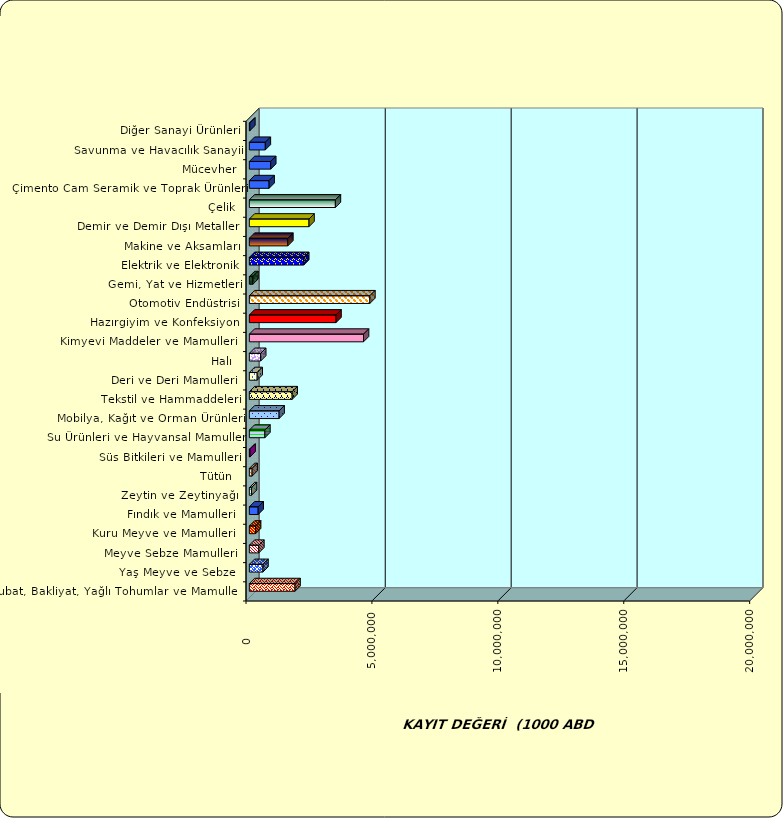
| Category | Series 0 |
|---|---|
|  Hububat, Bakliyat, Yağlı Tohumlar ve Mamulleri  | 1814326.473 |
|  Yaş Meyve ve Sebze   | 540674.135 |
|  Meyve Sebze Mamulleri  | 376441.702 |
|  Kuru Meyve ve Mamulleri   | 247503.136 |
|  Fındık ve Mamulleri  | 350421.304 |
|  Zeytin ve Zeytinyağı  | 85065.91 |
|  Tütün  | 110002.263 |
|  Süs Bitkileri ve Mamulleri | 28211.827 |
|  Su Ürünleri ve Hayvansal Mamuller | 617263.378 |
|  Mobilya, Kağıt ve Orman Ürünleri | 1181467.395 |
|  Tekstil ve Hammaddeleri | 1699930.507 |
|  Deri ve Deri Mamulleri  | 311298.946 |
|  Halı  | 450575.122 |
|  Kimyevi Maddeler ve Mamulleri   | 4533355.204 |
|  Hazırgiyim ve Konfeksiyon  | 3440793.24 |
|  Otomotiv Endüstrisi | 4785366.764 |
|  Gemi, Yat ve Hizmetleri | 141505.844 |
|  Elektrik ve Elektronik | 2159249.774 |
|  Makine ve Aksamları | 1527223.189 |
|  Demir ve Demir Dışı Metaller  | 2368922.304 |
|  Çelik | 3416107.452 |
|  Çimento Cam Seramik ve Toprak Ürünleri | 783756.409 |
|  Mücevher | 848686.901 |
|  Savunma ve Havacılık Sanayii | 633997.684 |
|  Diğer Sanayi Ürünleri | 18265.617 |